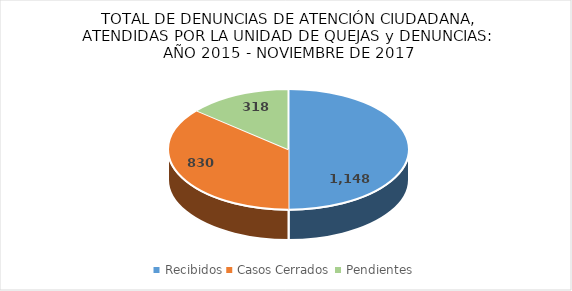
| Category | Series 0 |
|---|---|
| Recibidos | 1148 |
| Casos Cerrados | 830 |
| Pendientes | 318 |